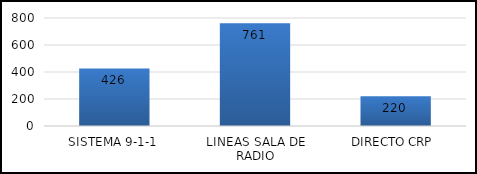
| Category | TOTAL |
|---|---|
| SISTEMA 9-1-1 | 426 |
| LINEAS SALA DE RADIO | 761 |
| DIRECTO CRP  | 220 |